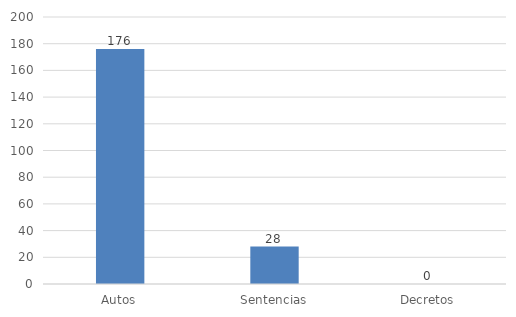
| Category | Series 0 |
|---|---|
| Autos | 176 |
| Sentencias | 28 |
| Decretos | 0 |